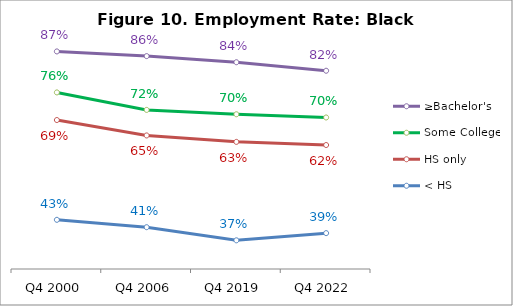
| Category | ≥Bachelor's | Some College | HS only | < HS |
|---|---|---|---|---|
| Q4 2000 | 0.868 | 0.761 | 0.689 | 0.428 |
| Q4 2006 | 0.855 | 0.715 | 0.648 | 0.409 |
| Q4 2019 | 0.839 | 0.704 | 0.632 | 0.375 |
| Q4 2022 | 0.817 | 0.695 | 0.623 | 0.394 |